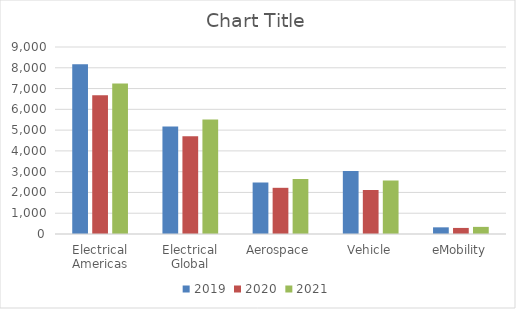
| Category | 2019 | 2020 | 2021 |
|---|---|---|---|
| Electrical Americas | 8175 | 6680 | 7242 |
| Electrical Global | 5172 | 4703 | 5516 |
| Aerospace | 2480 | 2223 | 2648 |
| Vehicle | 3038 | 2118 | 2579 |
| eMobility | 321 | 292 | 343 |